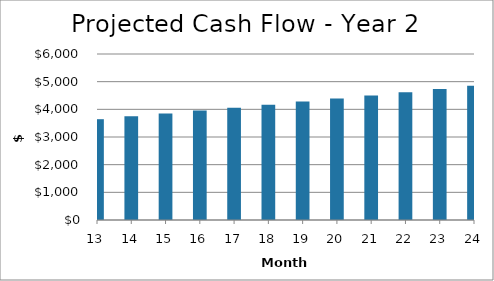
| Category | Year 2 |
|---|---|
| 13.0 | 3643.583 |
| 14.0 | 3745.781 |
| 15.0 | 3849.508 |
| 16.0 | 3954.77 |
| 17.0 | 4061.57 |
| 18.0 | 4169.91 |
| 19.0 | 4279.79 |
| 20.0 | 4391.21 |
| 21.0 | 4504.167 |
| 22.0 | 4618.657 |
| 23.0 | 4734.673 |
| 24.0 | 4852.209 |